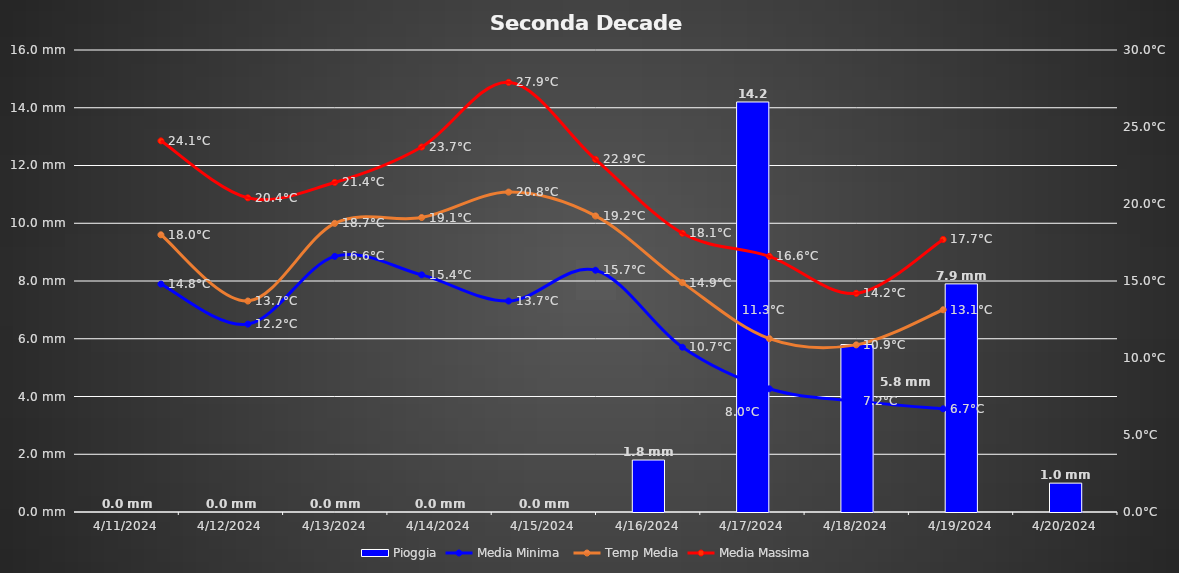
| Category | Pioggia |
|---|---|
| 4/11/24 | 0 |
| 4/12/24 | 0 |
| 4/13/24 | 0 |
| 4/14/24 | 0 |
| 4/15/24 | 0 |
| 4/16/24 | 1900-01-01 19:12:00 |
| 4/17/24 | 1900-01-14 04:48:00 |
| 4/18/24 | 1900-01-05 19:12:00 |
| 4/19/24 | 1900-01-07 21:36:00 |
| 4/20/24 | 1900-01-01 |